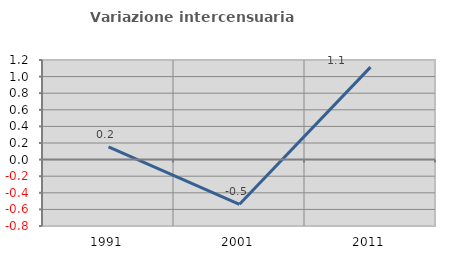
| Category | Variazione intercensuaria annua |
|---|---|
| 1991.0 | 0.155 |
| 2001.0 | -0.538 |
| 2011.0 | 1.114 |